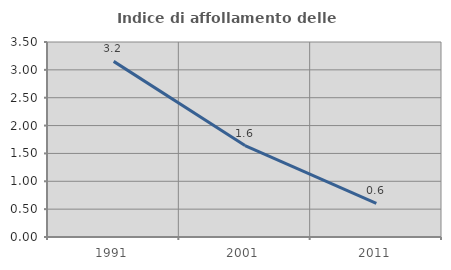
| Category | Indice di affollamento delle abitazioni  |
|---|---|
| 1991.0 | 3.152 |
| 2001.0 | 1.642 |
| 2011.0 | 0.604 |